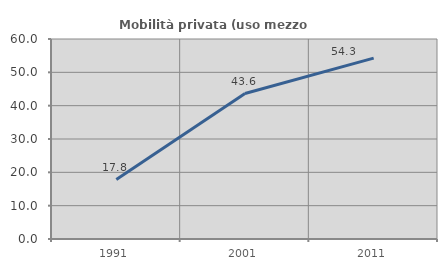
| Category | Mobilità privata (uso mezzo privato) |
|---|---|
| 1991.0 | 17.814 |
| 2001.0 | 43.649 |
| 2011.0 | 54.258 |